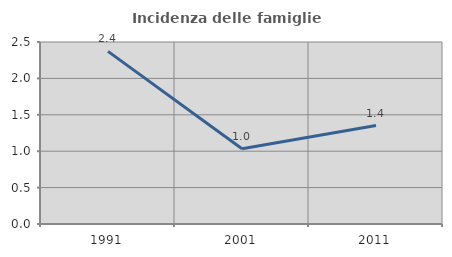
| Category | Incidenza delle famiglie numerose |
|---|---|
| 1991.0 | 2.371 |
| 2001.0 | 1.033 |
| 2011.0 | 1.352 |